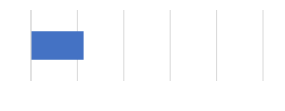
| Category | Series 0 |
|---|---|
| 0 | 0.227 |